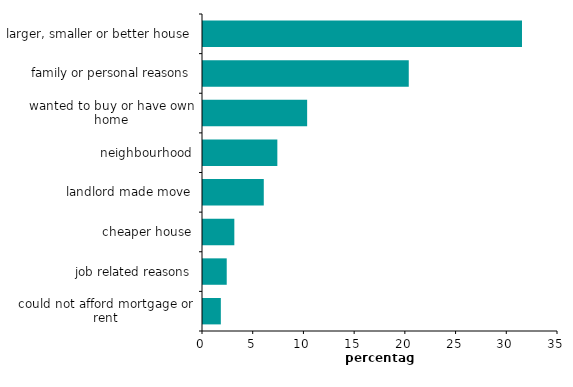
| Category | Series 0 |
|---|---|
| larger, smaller or better house | 31.45 |
| family or personal reasons | 20.287 |
| wanted to buy or have own home | 10.268 |
| neighbourhood | 7.329 |
| landlord made move | 5.992 |
| cheaper house | 3.089 |
| job related reasons | 2.339 |
| could not afford mortgage or rent | 1.758 |